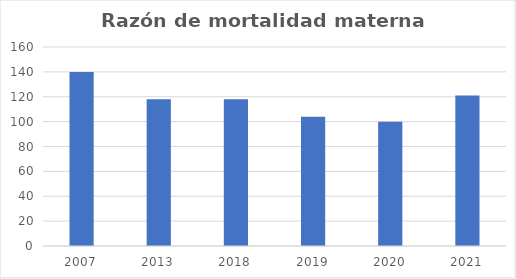
| Category | número de defunciones maternas |
|---|---|
| 2007.0 | 140 |
| 2013.0 | 118 |
| 2018.0 | 118 |
| 2019.0 | 104 |
| 2020.0 | 100 |
| 2021.0 | 121 |